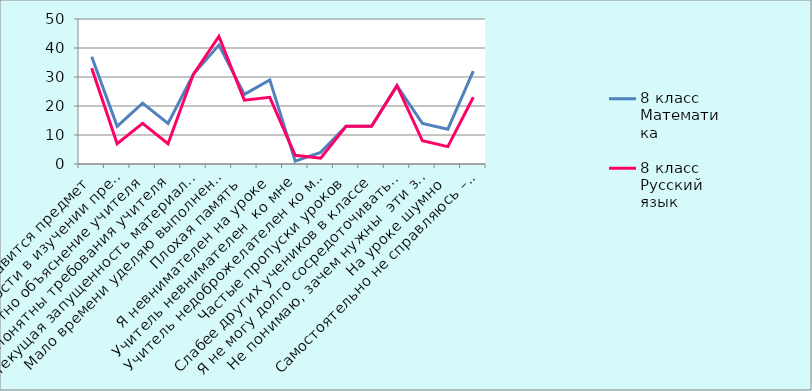
| Category | 8 класс Математика | 8 класс Русский язык |
|---|---|---|
| Не нравится предмет | 37 | 33 |
| Нет потребности в изучении предмета | 13 | 7 |
| Непонятно объяснение учителя | 21 | 14 |
| Непонятны требования учителя | 14 | 7 |
| Текущая запущенность материала из-за лени | 31 | 31 |
| Мало времени уделяю выполнению д/з | 41 | 44 |
| Плохая память | 24 | 22 |
| Я невнимателен на уроке | 29 | 23 |
| Учитель невнимателен  ко мне | 1 | 3 |
| Учитель недоброжелателен ко мне | 4 | 2 |
| Частые пропуски уроков | 13 | 13 |
| Слабее других учеников в классе | 13 | 13 |
| Я не могу долго сосредоточивать внимание | 27 | 27 |
| Не понимаю, зачем нужны  эти знания | 14 | 8 |
| На уроке шумно | 12 | 6 |
| Самостоятельно не справляюсь – нужна помощь   | 32 | 23 |